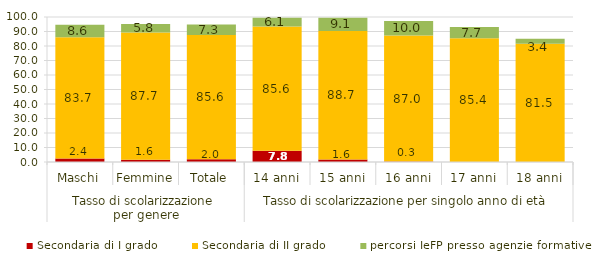
| Category | Secondaria di I grado | Secondaria di II grado | percorsi IeFP presso agenzie formative |
|---|---|---|---|
| 0 | 2.371 | 83.681 | 8.617 |
| 1 | 1.557 | 87.718 | 5.834 |
| 2 | 1.977 | 85.633 | 7.271 |
| 3 | 7.824 | 85.586 | 6.139 |
| 4 | 1.642 | 88.681 | 9.109 |
| 5 | 0.304 | 86.954 | 9.984 |
| 6 | 0 | 85.369 | 7.681 |
| 7 | 0 | 81.548 | 3.445 |